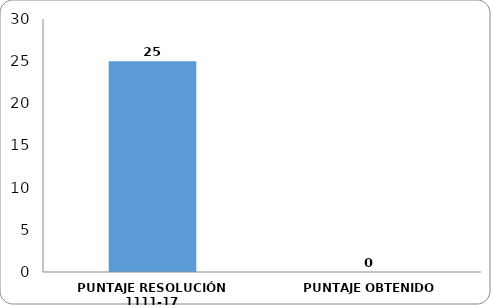
| Category | III. VERIFICAR |
|---|---|
| PUNTAJE RESOLUCIÓN 1111-17 | 25 |
| PUNTAJE OBTENIDO | 0 |